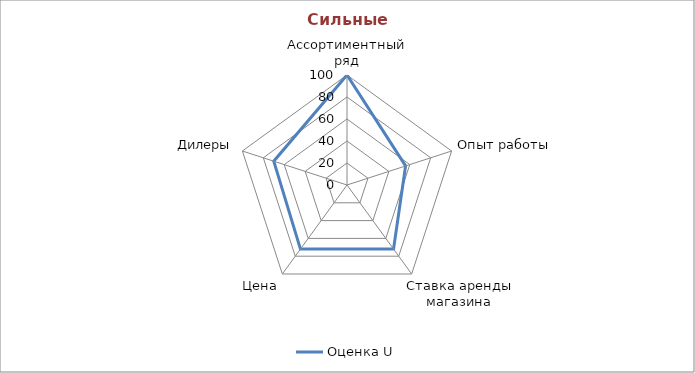
| Category | Оценка U |
|---|---|
| Ассортиментный ряд | 100 |
| Опыт работы | 56 |
| Ставка аренды магазина | 72 |
| Цена | 72 |
| Дилеры | 70 |